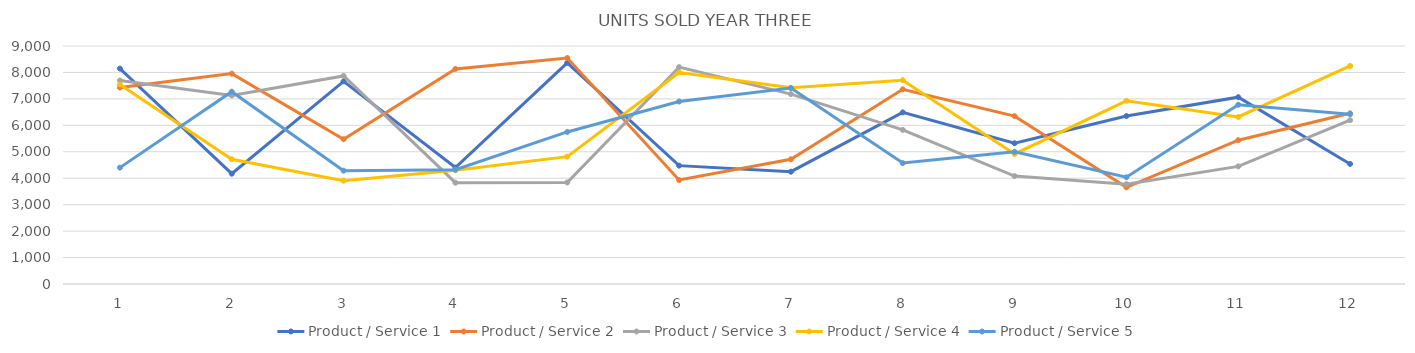
| Category | Product / Service 1 | Product / Service 2 | Product / Service 3 | Product / Service 4 | Product / Service 5 |
|---|---|---|---|---|---|
| 0 | 8146 | 7430 | 7694 | 7544 | 4401 |
| 1 | 4171 | 7956 | 7127 | 4716 | 7273 |
| 2 | 7662 | 5475 | 7868 | 3907 | 4286 |
| 3 | 4404 | 8133 | 3831 | 4302 | 4322 |
| 4 | 8362 | 8546 | 3840 | 4816 | 5750 |
| 5 | 4476 | 3933 | 8201 | 7998 | 6900 |
| 6 | 4247 | 4715 | 7181 | 7419 | 7411 |
| 7 | 6489 | 7362 | 5828 | 7707 | 4573 |
| 8 | 5323 | 6348 | 4082 | 4919 | 4999 |
| 9 | 6351 | 3656 | 3773 | 6927 | 4036 |
| 10 | 7065 | 5437 | 4447 | 6317 | 6777 |
| 11 | 4540 | 6454 | 6195 | 8245 | 6421 |